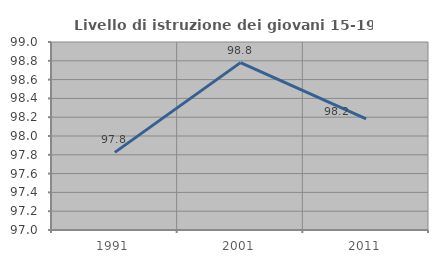
| Category | Livello di istruzione dei giovani 15-19 anni |
|---|---|
| 1991.0 | 97.826 |
| 2001.0 | 98.78 |
| 2011.0 | 98.182 |